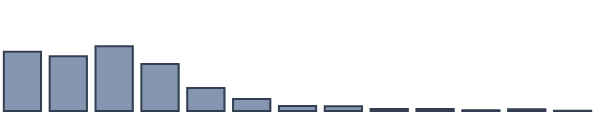
| Category | Series 0 |
|---|---|
| 0 | 21.364 |
| 1 | 19.773 |
| 2 | 23.333 |
| 3 | 16.97 |
| 4 | 8.333 |
| 5 | 4.318 |
| 6 | 1.818 |
| 7 | 1.742 |
| 8 | 0.758 |
| 9 | 0.682 |
| 10 | 0.227 |
| 11 | 0.606 |
| 12 | 0.076 |